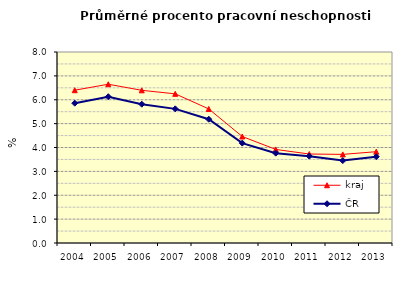
| Category | kraj | ČR |
|---|---|---|
| 2004.0 | 6.399 | 5.857 |
| 2005.0 | 6.65 | 6.126 |
| 2006.0 | 6.395 | 5.814 |
| 2007.0 | 6.248 | 5.619 |
| 2008.0 | 5.616 | 5.184 |
| 2009.0 | 4.461 | 4.184 |
| 2010.0 | 3.919 | 3.763 |
| 2011.0 | 3.727 | 3.638 |
| 2012.0 | 3.712 | 3.452 |
| 2013.0 | 3.824 | 3.615 |